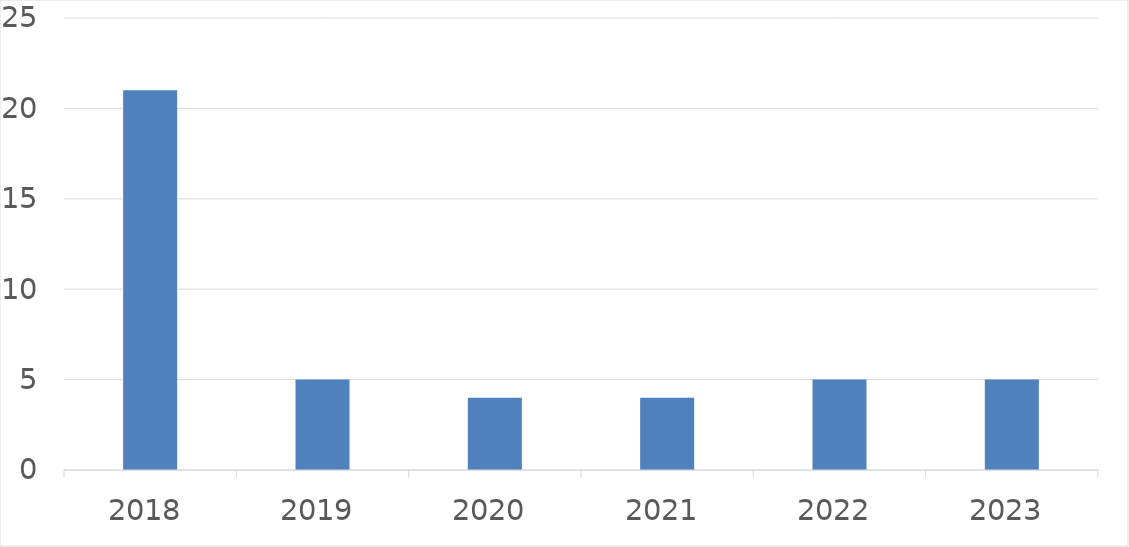
| Category | Series 0 |
|---|---|
| 2018 | 21 |
| 2019 | 5 |
| 2020 | 4 |
| 2021 | 4 |
| 2022 | 5 |
| 2023 | 5 |